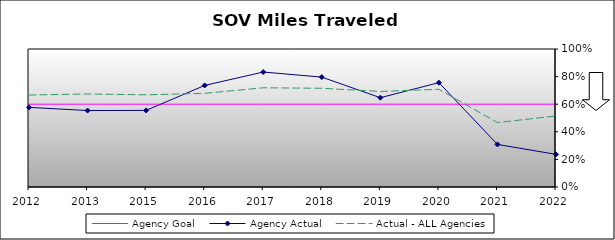
| Category | Agency Goal | Agency Actual | Actual - ALL Agencies |
|---|---|---|---|
| 2012.0 | 0.6 | 0.577 | 0.666 |
| 2013.0 | 0.6 | 0.554 | 0.674 |
| 2015.0 | 0.6 | 0.555 | 0.668 |
| 2016.0 | 0.6 | 0.736 | 0.679 |
| 2017.0 | 0.6 | 0.833 | 0.719 |
| 2018.0 | 0.6 | 0.796 | 0.715 |
| 2019.0 | 0.6 | 0.647 | 0.692 |
| 2020.0 | 0.6 | 0.756 | 0.708 |
| 2021.0 | 0.6 | 0.308 | 0.467 |
| 2022.0 | 0.6 | 0.237 | 0.515 |